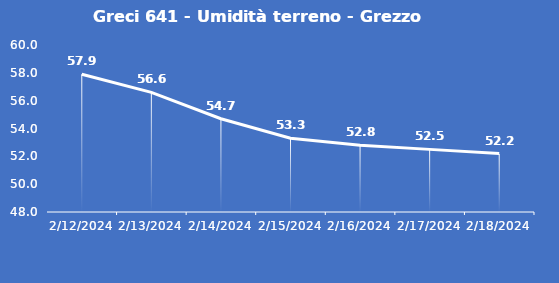
| Category | Greci 641 - Umidità terreno - Grezzo (%VWC) |
|---|---|
| 2/12/24 | 57.9 |
| 2/13/24 | 56.6 |
| 2/14/24 | 54.7 |
| 2/15/24 | 53.3 |
| 2/16/24 | 52.8 |
| 2/17/24 | 52.5 |
| 2/18/24 | 52.2 |